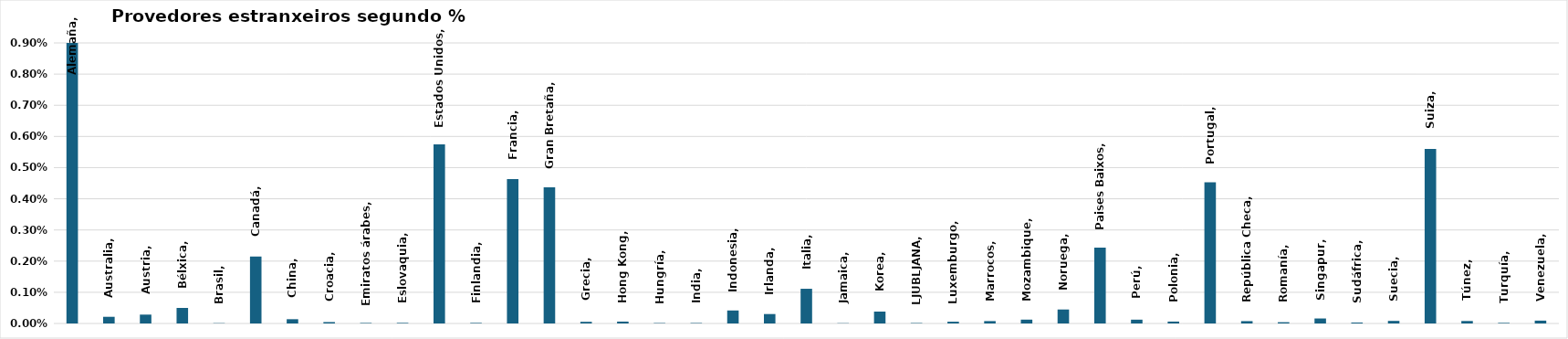
| Category | Series 0 |
|---|---|
| Alemaña | 0.013 |
| Australia | 0 |
| Austria | 0 |
| Bélxica | 0 |
| Brasil | 0 |
| Canadá | 0.002 |
| China | 0 |
| Croacia | 0 |
| Emiratos árabes | 0 |
| Eslovaquia | 0 |
| Estados Unidos | 0.006 |
| Finlandia | 0 |
| Francia | 0.005 |
| Gran Bretaña | 0.004 |
| Grecia | 0 |
| Hong Kong | 0 |
| Hungría | 0 |
| India | 0 |
| Indonesia | 0 |
| Irlanda | 0 |
| Italia | 0.001 |
| Jamaica | 0 |
| Korea | 0 |
| LJUBLJANA | 0 |
| Luxemburgo | 0 |
| Marrocos | 0 |
| Mozambique | 0 |
| Noruega | 0 |
| Paises Baixos | 0.002 |
| Perú | 0 |
| Polonia | 0 |
| Portugal | 0.005 |
| República Checa | 0 |
| Romanía | 0 |
| Singapur | 0 |
| Sudáfrica | 0 |
| Suecia | 0 |
| Suiza | 0.006 |
| Túnez | 0 |
| Turquía | 0 |
| Venezuela | 0 |